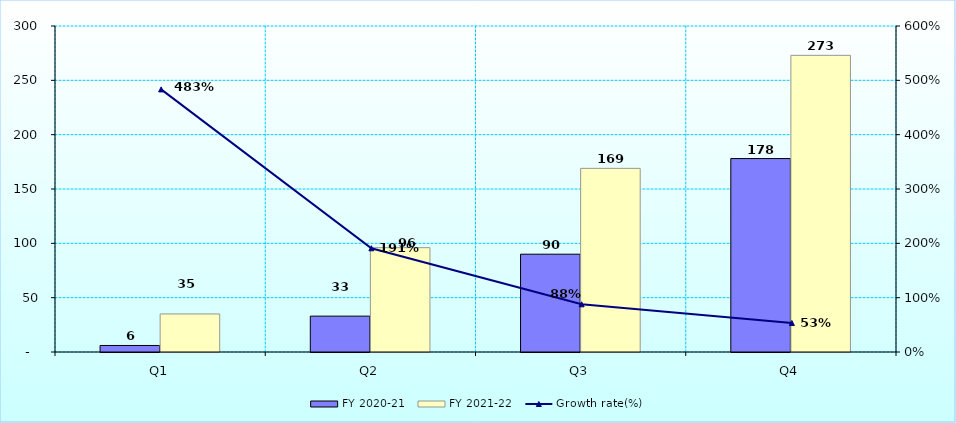
| Category | FY 2020-21 | FY 2021-22 |
|---|---|---|
| Q1 | 6 | 35 |
| Q2 | 33 | 96 |
| Q3 | 90 | 169 |
| Q4 | 178 | 273 |